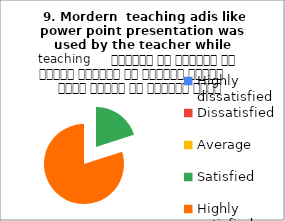
| Category |  9. Mordern  teaching adis like power point presentation was used by the teacher while teaching     शिक्षक ने शिक्षण के दौरान शिक्षण की आधुनिक तकनीक     पावर पॉइंट का प्रयोग किया |
|---|---|
| Highly dissatisfied | 0 |
| Dissatisfied | 0 |
| Average | 0 |
| Satisfied | 1 |
| Highly satisfied | 4 |